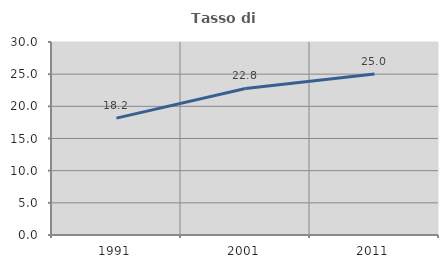
| Category | Tasso di occupazione   |
|---|---|
| 1991.0 | 18.163 |
| 2001.0 | 22.779 |
| 2011.0 | 25.031 |